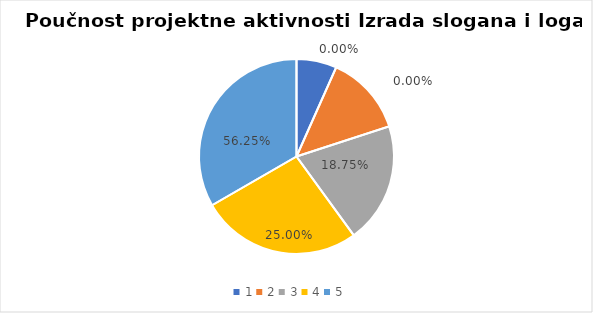
| Category | Series 0 | Series 1 |
|---|---|---|
| 0 | 1 | 0 |
| 1 | 2 | 0 |
| 2 | 3 | 0.188 |
| 3 | 4 | 0.25 |
| 4 | 5 | 0.562 |